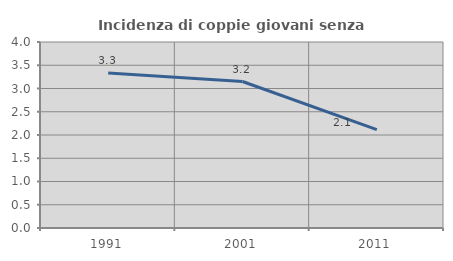
| Category | Incidenza di coppie giovani senza figli |
|---|---|
| 1991.0 | 3.333 |
| 2001.0 | 3.151 |
| 2011.0 | 2.117 |